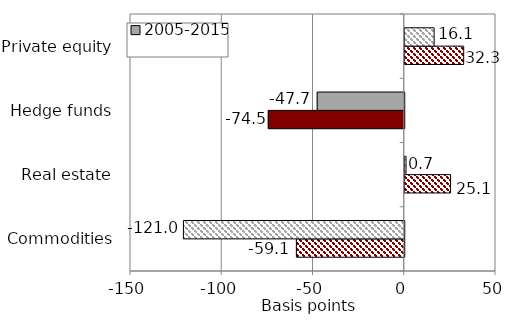
| Category | 2010-2015 | 2005-2015 |
|---|---|---|
| Commodities | -59.1 | -121 |
| Real estate | 25.1 | 0.717 |
| Hedge funds | -74.5 | -47.7 |
| Private equity | 32.3 | 16.1 |